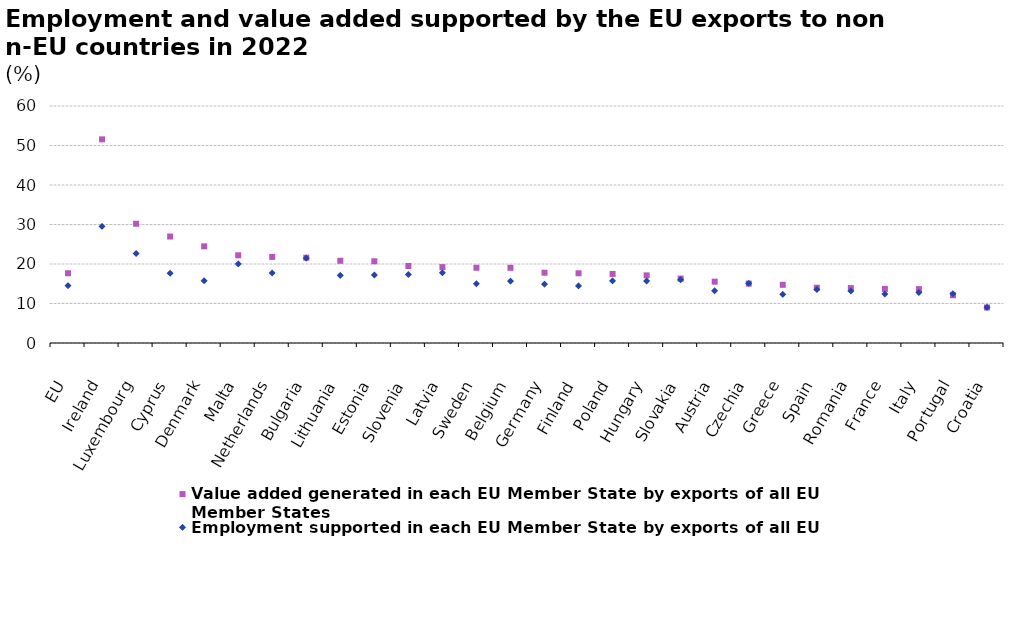
| Category | Value added generated in each EU Member State by exports of all EU Member States | Employment supported in each EU Member State by exports of all EU Member States |
|---|---|---|
| EU | 17.657 | 14.522 |
| Ireland | 51.555 | 29.507 |
| Luxembourg | 30.186 | 22.671 |
| Cyprus | 26.952 | 17.677 |
| Denmark | 24.478 | 15.775 |
| Malta | 22.203 | 20.024 |
| Netherlands | 21.797 | 17.722 |
| Bulgaria | 21.596 | 21.472 |
| Lithuania | 20.815 | 17.104 |
| Estonia | 20.691 | 17.206 |
| Slovenia | 19.487 | 17.318 |
| Latvia | 19.213 | 17.769 |
| Sweden | 19.041 | 15.001 |
| Belgium | 19.04 | 15.674 |
| Germany | 17.793 | 14.924 |
| Finland | 17.655 | 14.477 |
| Poland | 17.486 | 15.725 |
| Hungary | 17.121 | 15.695 |
| Slovakia | 16.31 | 16.025 |
| Austria | 15.526 | 13.235 |
| Czechia | 15.041 | 15.081 |
| Greece | 14.734 | 12.285 |
| Spain | 13.988 | 13.543 |
| Romania | 13.899 | 13.142 |
| France | 13.693 | 12.4 |
| Italy | 13.639 | 12.777 |
| Portugal | 12.089 | 12.474 |
| Croatia | 8.992 | 8.995 |